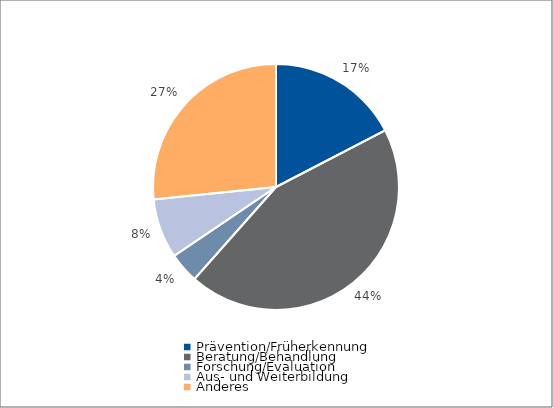
| Category | Series 0 |
|---|---|
| Prävention/Früherkennung | 16020.12 |
| Beratung/Behandlung | 40732.07 |
| Forschung/Evaluation | 3684.94 |
| Aus- und Weiterbildung | 7248.4 |
| Anderes | 24539.45 |